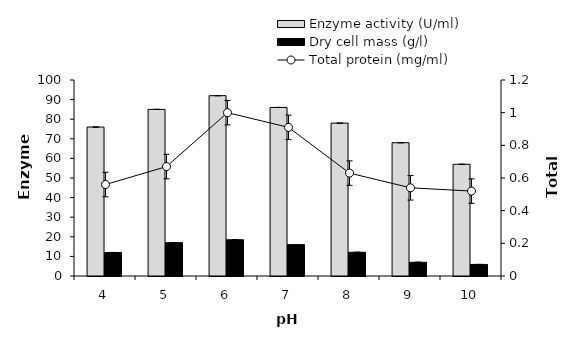
| Category | Enzyme activity (U/ml) | Dry cell mass (g/l) |
|---|---|---|
| 4.0 | 76 | 12 |
| 5.0 | 85 | 17 |
| 6.0 | 92 | 18.5 |
| 7.0 | 86 | 16 |
| 8.0 | 78 | 12.1 |
| 9.0 | 68 | 7 |
| 10.0 | 57 | 5.9 |